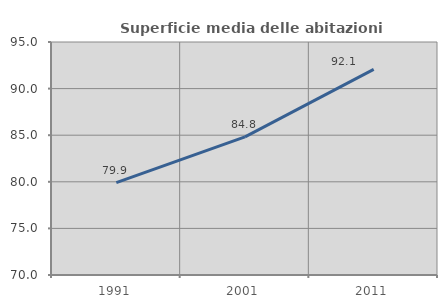
| Category | Superficie media delle abitazioni occupate |
|---|---|
| 1991.0 | 79.912 |
| 2001.0 | 84.818 |
| 2011.0 | 92.059 |